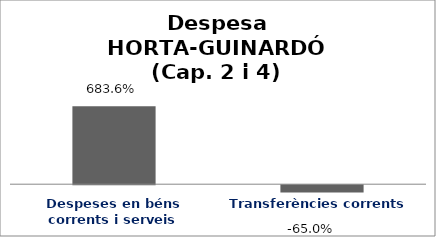
| Category | Series 0 |
|---|---|
| Despeses en béns corrents i serveis | 6.836 |
| Transferències corrents | -0.65 |